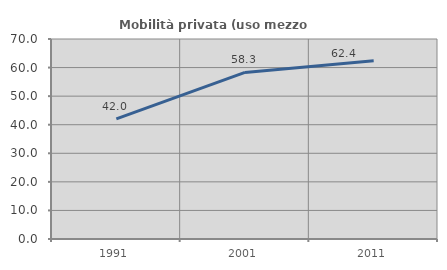
| Category | Mobilità privata (uso mezzo privato) |
|---|---|
| 1991.0 | 42.034 |
| 2001.0 | 58.296 |
| 2011.0 | 62.366 |